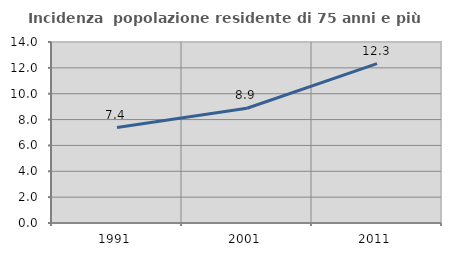
| Category | Incidenza  popolazione residente di 75 anni e più |
|---|---|
| 1991.0 | 7.382 |
| 2001.0 | 8.875 |
| 2011.0 | 12.325 |